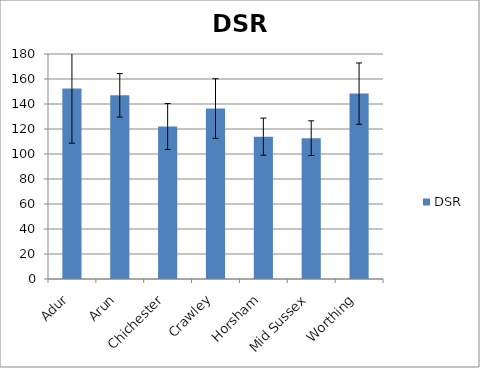
| Category | DSR |
|---|---|
| Adur  | 152.447 |
| Arun | 146.925 |
| Chichester | 121.964 |
| Crawley | 136.39 |
| Horsham | 113.88 |
| Mid Sussex | 112.655 |
| Worthing | 148.316 |